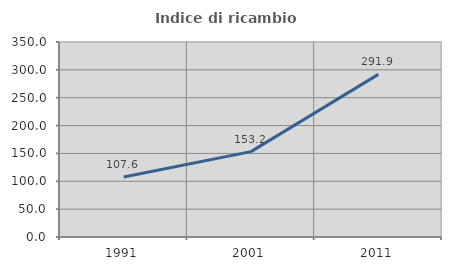
| Category | Indice di ricambio occupazionale  |
|---|---|
| 1991.0 | 107.555 |
| 2001.0 | 153.239 |
| 2011.0 | 291.863 |